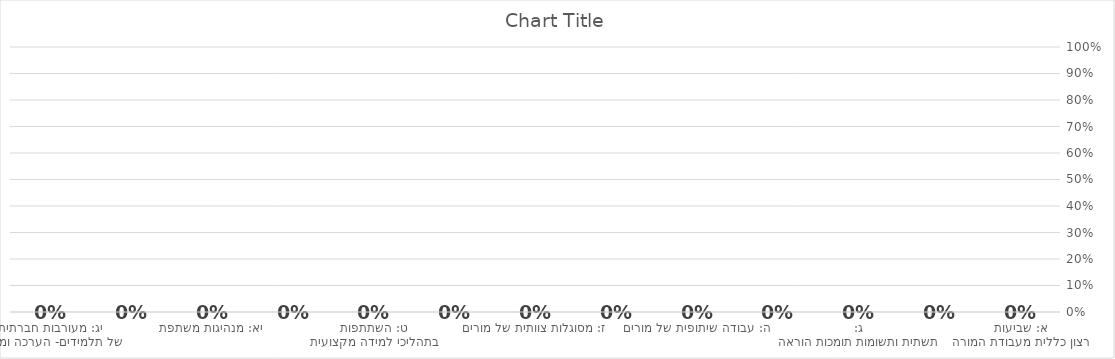
| Category | Series 0 |
|---|---|
| א: שביעות רצון כללית מעבודת המורה | 0 |
| ב: היעדר תחושת מוגנות של מורים | 0 |
| ג: תשתית ותשומות תומכות הוראה | 0 |
| ד: שותפות הורים בבית הספר  | 0 |
| ה: עבודה שיתופית של מורים | 0 |
|  ו: קהילת למידה של מורים | 0 |
| ז: מסוגלות צוותית של מורים | 0 |
| ח: תכנון תהליכי הלמידה המקצועית של מורים | 0 |
| ט: השתתפות בתהליכי למידה מקצועית | 0 |
| י: ניהול מנגנונים ושגרות בבית הספר | 0 |
| יא: מנהיגות משתפת | 0 |
| יב: הקניית מיומנויות רגשיות – חברתיות לתלמידים | 0 |
| יג: מעורבות חברתית של תלמידים- הערכה ומשוב | 0 |